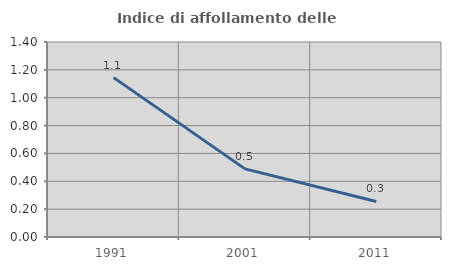
| Category | Indice di affollamento delle abitazioni  |
|---|---|
| 1991.0 | 1.144 |
| 2001.0 | 0.489 |
| 2011.0 | 0.255 |